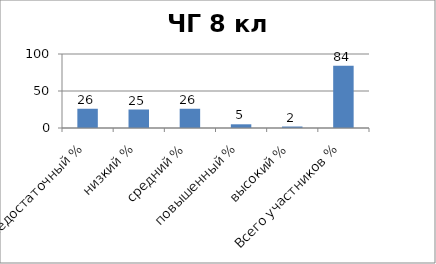
| Category | Series 0 |
|---|---|
| недостаточный % | 26 |
| низкий % | 25 |
| средний % | 26 |
| повышенный % | 5 |
| высокий % | 2 |
| Всего участников % | 84 |